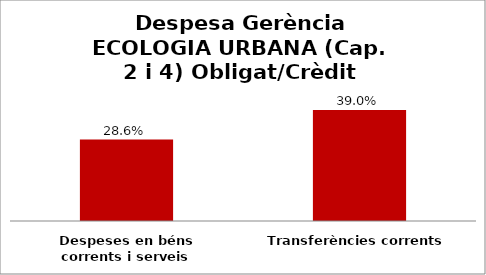
| Category | Series 0 |
|---|---|
| Despeses en béns corrents i serveis | 0.286 |
| Transferències corrents | 0.39 |